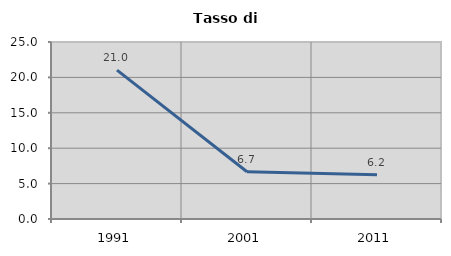
| Category | Tasso di disoccupazione   |
|---|---|
| 1991.0 | 21.028 |
| 2001.0 | 6.667 |
| 2011.0 | 6.234 |